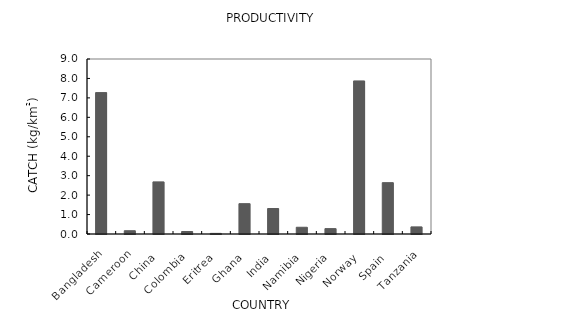
| Category | Catch (kg) pr km2 |
|---|---|
| Bangladesh | 7.272 |
| Cameroon | 0.168 |
| China | 2.679 |
| Colombia | 0.128 |
| Eritrea | 0.032 |
| Ghana | 1.56 |
| India | 1.31 |
| Namibia | 0.347 |
| Nigeria | 0.277 |
| Norway | 7.873 |
| Spain | 2.64 |
| Tanzania | 0.365 |